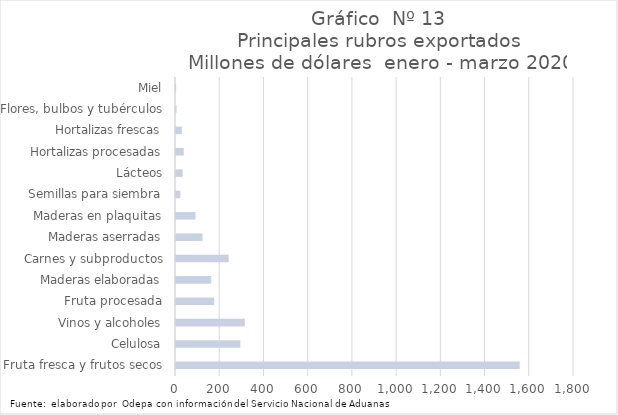
| Category | Series 7 |
|---|---|
| Fruta fresca y frutos secos | 1554541.696 |
| Celulosa | 290993.635 |
| Vinos y alcoholes | 311168.471 |
| Fruta procesada | 172808.455 |
| Maderas elaboradas | 159267.119 |
| Carnes y subproductos | 238207.043 |
| Maderas aserradas | 119949.067 |
| Maderas en plaquitas | 87930.49 |
| Semillas para siembra | 19660.162 |
| Lácteos | 29904.281 |
| Hortalizas procesadas | 35047.344 |
| Hortalizas frescas | 26276.088 |
| Flores, bulbos y tubérculos | 2537.728 |
| Miel | 453.091 |